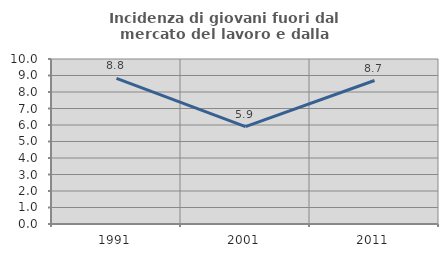
| Category | Incidenza di giovani fuori dal mercato del lavoro e dalla formazione  |
|---|---|
| 1991.0 | 8.83 |
| 2001.0 | 5.897 |
| 2011.0 | 8.696 |